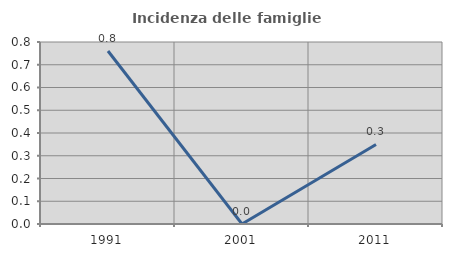
| Category | Incidenza delle famiglie numerose |
|---|---|
| 1991.0 | 0.76 |
| 2001.0 | 0 |
| 2011.0 | 0.35 |